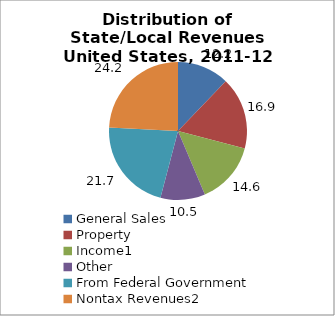
| Category | Series 0 |
|---|---|
| General Sales | 12.157 |
| Property | 16.928 |
| Income1 | 14.552 |
| Other | 10.462 |
| From Federal Government | 21.731 |
| Nontax Revenues2 | 24.17 |